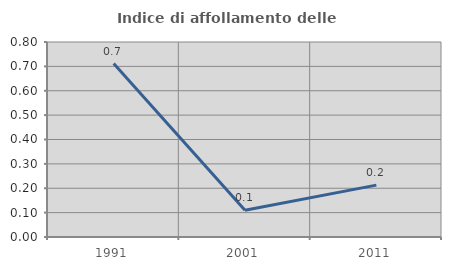
| Category | Indice di affollamento delle abitazioni  |
|---|---|
| 1991.0 | 0.712 |
| 2001.0 | 0.109 |
| 2011.0 | 0.213 |